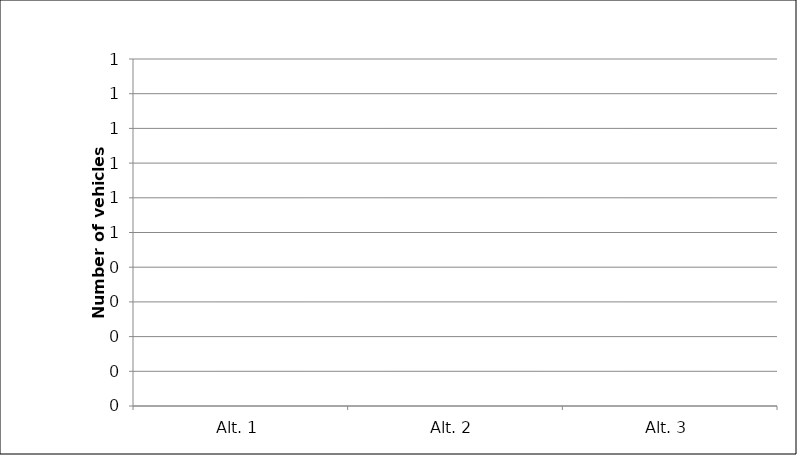
| Category | Number of Vehicles Removed from Fleet Corresponding to Emissions Reductions from Baseline Alternative |
|---|---|
| Alt. 1 | 0 |
| Alt. 2 | 0 |
| Alt. 3 | 0 |